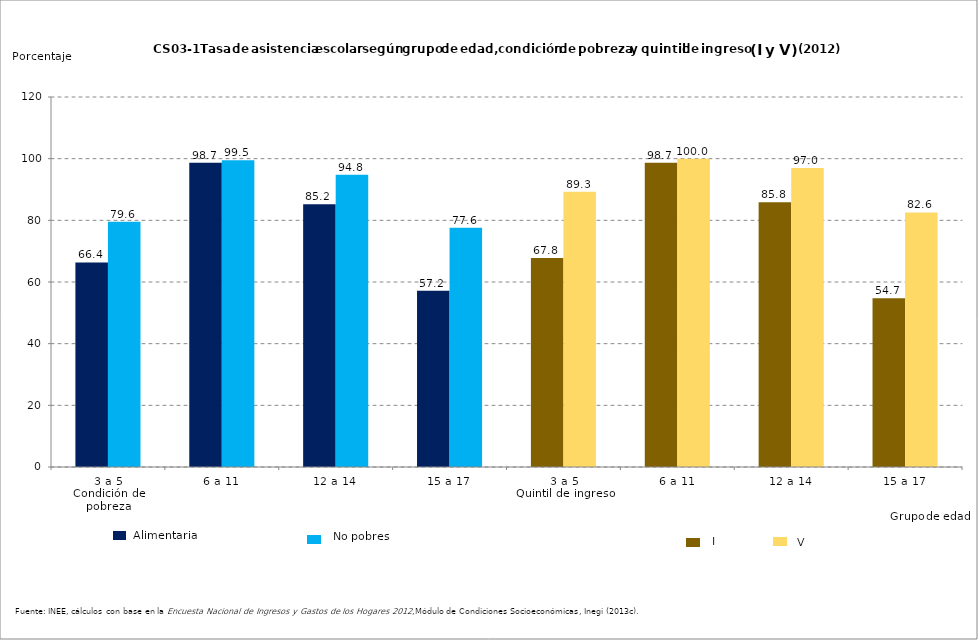
| Category | Series 0 | Series 1 |
|---|---|---|
| 0 | 66.356 | 79.578 |
| 1 | 98.689 | 99.504 |
| 2 | 85.25 | 94.818 |
| 3 | 57.151 | 77.609 |
| 4 | 67.766 | 89.284 |
| 5 | 98.701 | 100 |
| 6 | 85.841 | 96.99 |
| 7 | 54.699 | 82.568 |